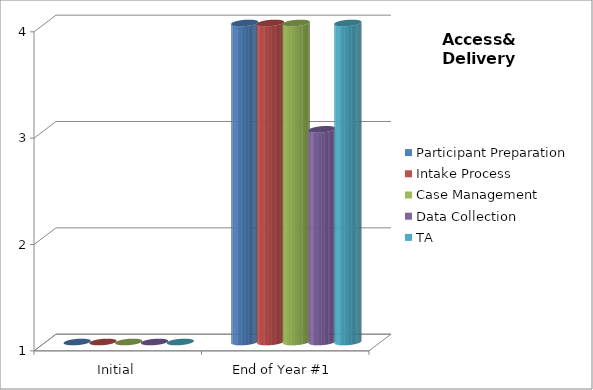
| Category | Participant Preparation  | Intake Process  | Case Management  | Data Collection  | TA |
|---|---|---|---|---|---|
| Initial | 1 | 1 | 1 | 1 | 1 |
| End of Year #1 | 4 | 4 | 4 | 3 | 4 |